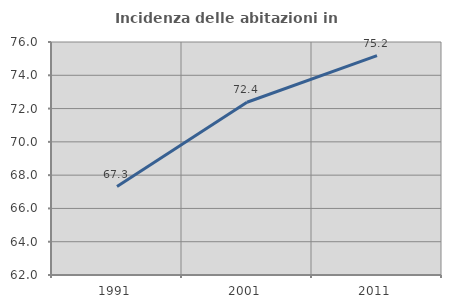
| Category | Incidenza delle abitazioni in proprietà  |
|---|---|
| 1991.0 | 67.315 |
| 2001.0 | 72.38 |
| 2011.0 | 75.176 |